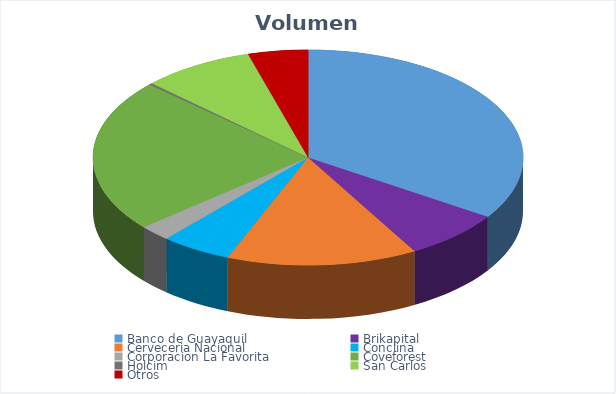
| Category | VOLUMEN ($USD) |
|---|---|
| Banco de Guayaquil | 18323.4 |
| Brikapital | 4000 |
| Cerveceria Nacional | 7650 |
| Conclina | 2846.9 |
| Corporacion La Favorita | 1278.9 |
| Coveforest | 12303.2 |
| Holcim | 140 |
| San Carlos | 4500 |
| Otros | 2403 |